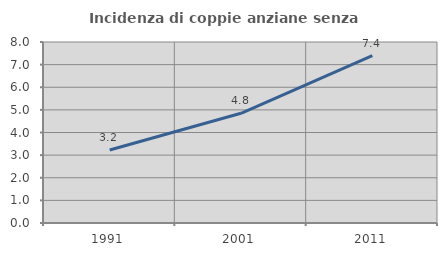
| Category | Incidenza di coppie anziane senza figli  |
|---|---|
| 1991.0 | 3.226 |
| 2001.0 | 4.848 |
| 2011.0 | 7.396 |